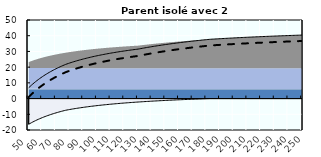
| Category | Coin fiscal moyen (somme des composantes) | Taux moyen d'imposition net en % du salaire brut |
|---|---|---|
| 50.0 | 6.871 | 0.957 |
| 51.0 | 7.702 | 1.841 |
| 52.0 | 8.501 | 2.691 |
| 53.0 | 9.27 | 3.508 |
| 54.0 | 10.01 | 4.296 |
| 55.0 | 10.724 | 5.055 |
| 56.0 | 11.412 | 5.786 |
| 57.0 | 12.076 | 6.492 |
| 58.0 | 12.717 | 7.174 |
| 59.0 | 13.336 | 7.833 |
| 60.0 | 13.935 | 8.469 |
| 61.0 | 14.514 | 9.085 |
| 62.0 | 15.074 | 9.681 |
| 63.0 | 15.616 | 10.258 |
| 64.0 | 16.142 | 10.817 |
| 65.0 | 16.651 | 11.359 |
| 66.0 | 17.145 | 11.884 |
| 67.0 | 17.625 | 12.394 |
| 68.0 | 18.09 | 12.889 |
| 69.0 | 18.541 | 13.369 |
| 70.0 | 18.98 | 13.835 |
| 71.0 | 19.407 | 14.289 |
| 72.0 | 19.821 | 14.73 |
| 73.0 | 20.224 | 15.159 |
| 74.0 | 20.617 | 15.576 |
| 75.0 | 20.998 | 15.982 |
| 76.0 | 21.37 | 16.377 |
| 77.0 | 21.732 | 16.762 |
| 78.0 | 22.048 | 17.098 |
| 79.0 | 22.346 | 17.415 |
| 80.0 | 22.637 | 17.725 |
| 81.0 | 22.921 | 18.027 |
| 82.0 | 23.199 | 18.322 |
| 83.0 | 23.469 | 18.609 |
| 84.0 | 23.733 | 18.89 |
| 85.0 | 23.991 | 19.164 |
| 86.0 | 24.243 | 19.432 |
| 87.0 | 24.489 | 19.694 |
| 88.0 | 24.729 | 19.949 |
| 89.0 | 24.964 | 20.199 |
| 90.0 | 25.194 | 20.443 |
| 91.0 | 25.418 | 20.682 |
| 92.0 | 25.638 | 20.916 |
| 93.0 | 25.853 | 21.145 |
| 94.0 | 26.064 | 21.369 |
| 95.0 | 26.27 | 21.588 |
| 96.0 | 26.472 | 21.803 |
| 97.0 | 26.669 | 22.013 |
| 98.0 | 26.863 | 22.219 |
| 99.0 | 27.053 | 22.421 |
| 100.0 | 27.239 | 22.618 |
| 101.0 | 27.421 | 22.812 |
| 102.0 | 27.6 | 23.002 |
| 103.0 | 27.775 | 23.188 |
| 104.0 | 27.947 | 23.371 |
| 105.0 | 28.115 | 23.55 |
| 106.0 | 28.28 | 23.726 |
| 107.0 | 28.443 | 23.899 |
| 108.0 | 28.602 | 24.068 |
| 109.0 | 28.758 | 24.235 |
| 110.0 | 28.912 | 24.398 |
| 111.0 | 29.063 | 24.558 |
| 112.0 | 29.211 | 24.716 |
| 113.0 | 29.356 | 24.87 |
| 114.0 | 29.499 | 25.022 |
| 115.0 | 29.639 | 25.171 |
| 116.0 | 29.777 | 25.318 |
| 117.0 | 29.913 | 25.462 |
| 118.0 | 30.046 | 25.604 |
| 119.0 | 30.177 | 25.744 |
| 120.0 | 30.306 | 25.881 |
| 121.0 | 30.433 | 26.015 |
| 122.0 | 30.558 | 26.148 |
| 123.0 | 30.68 | 26.278 |
| 124.0 | 30.801 | 26.407 |
| 125.0 | 30.92 | 26.533 |
| 126.0 | 31.037 | 26.657 |
| 127.0 | 31.152 | 26.78 |
| 128.0 | 31.265 | 26.9 |
| 129.0 | 31.376 | 27.019 |
| 130.0 | 31.486 | 27.135 |
| 131.0 | 31.651 | 27.31 |
| 132.0 | 31.813 | 27.484 |
| 133.0 | 31.974 | 27.654 |
| 134.0 | 32.132 | 27.822 |
| 135.0 | 32.287 | 27.987 |
| 136.0 | 32.441 | 28.15 |
| 137.0 | 32.592 | 28.311 |
| 138.0 | 32.74 | 28.469 |
| 139.0 | 32.887 | 28.626 |
| 140.0 | 33.032 | 28.779 |
| 141.0 | 33.174 | 28.931 |
| 142.0 | 33.315 | 29.08 |
| 143.0 | 33.454 | 29.228 |
| 144.0 | 33.59 | 29.373 |
| 145.0 | 33.725 | 29.517 |
| 146.0 | 33.858 | 29.658 |
| 147.0 | 33.989 | 29.797 |
| 148.0 | 34.119 | 29.935 |
| 149.0 | 34.246 | 30.071 |
| 150.0 | 34.372 | 30.205 |
| 151.0 | 34.496 | 30.337 |
| 152.0 | 34.619 | 30.467 |
| 153.0 | 34.74 | 30.596 |
| 154.0 | 34.859 | 30.723 |
| 155.0 | 34.977 | 30.848 |
| 156.0 | 35.094 | 30.972 |
| 157.0 | 35.209 | 31.094 |
| 158.0 | 35.322 | 31.215 |
| 159.0 | 35.434 | 31.334 |
| 160.0 | 35.545 | 31.452 |
| 161.0 | 35.654 | 31.568 |
| 162.0 | 35.762 | 31.683 |
| 163.0 | 35.869 | 31.796 |
| 164.0 | 35.974 | 31.908 |
| 165.0 | 36.078 | 32.019 |
| 166.0 | 36.181 | 32.128 |
| 167.0 | 36.282 | 32.236 |
| 168.0 | 36.382 | 32.343 |
| 169.0 | 36.482 | 32.448 |
| 170.0 | 36.58 | 32.552 |
| 171.0 | 36.676 | 32.655 |
| 172.0 | 36.772 | 32.757 |
| 173.0 | 36.867 | 32.858 |
| 174.0 | 36.96 | 32.957 |
| 175.0 | 37.053 | 33.055 |
| 176.0 | 37.144 | 33.153 |
| 177.0 | 37.234 | 33.249 |
| 178.0 | 37.324 | 33.344 |
| 179.0 | 37.412 | 33.438 |
| 180.0 | 37.499 | 33.531 |
| 181.0 | 37.586 | 33.622 |
| 182.0 | 37.671 | 33.713 |
| 183.0 | 37.749 | 33.796 |
| 184.0 | 37.803 | 33.853 |
| 185.0 | 37.857 | 33.91 |
| 186.0 | 37.91 | 33.967 |
| 187.0 | 37.962 | 34.023 |
| 188.0 | 38.014 | 34.078 |
| 189.0 | 38.065 | 34.132 |
| 190.0 | 38.116 | 34.186 |
| 191.0 | 38.166 | 34.24 |
| 192.0 | 38.216 | 34.293 |
| 193.0 | 38.265 | 34.345 |
| 194.0 | 38.314 | 34.397 |
| 195.0 | 38.362 | 34.448 |
| 196.0 | 38.41 | 34.499 |
| 197.0 | 38.457 | 34.549 |
| 198.0 | 38.504 | 34.599 |
| 199.0 | 38.55 | 34.648 |
| 200.0 | 38.596 | 34.697 |
| 201.0 | 38.642 | 34.745 |
| 202.0 | 38.687 | 34.793 |
| 203.0 | 38.731 | 34.841 |
| 204.0 | 38.775 | 34.887 |
| 205.0 | 38.819 | 34.934 |
| 206.0 | 38.862 | 34.98 |
| 207.0 | 38.905 | 35.025 |
| 208.0 | 38.947 | 35.07 |
| 209.0 | 38.989 | 35.115 |
| 210.0 | 39.031 | 35.159 |
| 211.0 | 39.072 | 35.203 |
| 212.0 | 39.113 | 35.246 |
| 213.0 | 39.153 | 35.289 |
| 214.0 | 39.193 | 35.332 |
| 215.0 | 39.233 | 35.374 |
| 216.0 | 39.272 | 35.416 |
| 217.0 | 39.311 | 35.457 |
| 218.0 | 39.35 | 35.498 |
| 219.0 | 39.388 | 35.539 |
| 220.0 | 39.426 | 35.579 |
| 221.0 | 39.463 | 35.619 |
| 222.0 | 39.5 | 35.659 |
| 223.0 | 39.537 | 35.698 |
| 224.0 | 39.574 | 35.737 |
| 225.0 | 39.61 | 35.775 |
| 226.0 | 39.646 | 35.813 |
| 227.0 | 39.681 | 35.851 |
| 228.0 | 39.717 | 35.889 |
| 229.0 | 39.752 | 35.926 |
| 230.0 | 39.786 | 35.963 |
| 231.0 | 39.821 | 35.999 |
| 232.0 | 39.855 | 36.035 |
| 233.0 | 39.888 | 36.071 |
| 234.0 | 39.922 | 36.107 |
| 235.0 | 39.955 | 36.142 |
| 236.0 | 39.988 | 36.177 |
| 237.0 | 40.021 | 36.212 |
| 238.0 | 40.053 | 36.246 |
| 239.0 | 40.085 | 36.28 |
| 240.0 | 40.117 | 36.314 |
| 241.0 | 40.148 | 36.348 |
| 242.0 | 40.18 | 36.381 |
| 243.0 | 40.211 | 36.414 |
| 244.0 | 40.242 | 36.447 |
| 245.0 | 40.272 | 36.479 |
| 246.0 | 40.302 | 36.512 |
| 247.0 | 40.332 | 36.543 |
| 248.0 | 40.362 | 36.575 |
| 249.0 | 40.392 | 36.607 |
| 250.0 | 40.421 | 36.638 |